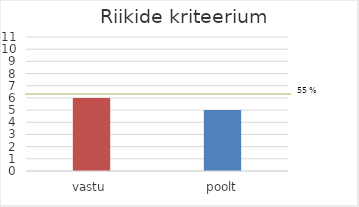
| Category | Series 0 |
|---|---|
| 0 | 6 |
| 1 | 5 |